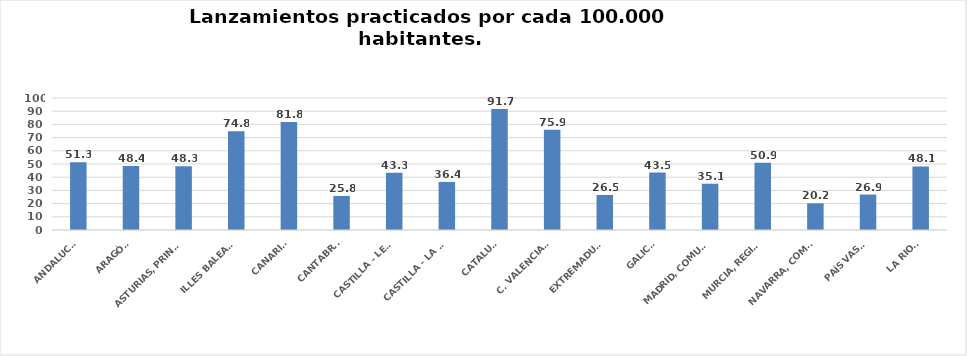
| Category | Series 0 |
|---|---|
| ANDALUCÍA | 51.324 |
| ARAGÓN | 48.405 |
| ASTURIAS, PRINCIPADO | 48.274 |
| ILLES BALEARS | 74.788 |
| CANARIAS | 81.829 |
| CANTABRIA | 25.794 |
| CASTILLA - LEÓN | 43.285 |
| CASTILLA - LA MANCHA | 36.429 |
| CATALUÑA | 91.728 |
| C. VALENCIANA | 75.893 |
| EXTREMADURA | 26.546 |
| GALICIA | 43.524 |
| MADRID, COMUNIDAD | 35.065 |
| MURCIA, REGIÓN | 50.853 |
| NAVARRA, COM. FORAL | 20.177 |
| PAÍS VASCO | 26.855 |
| LA RIOJA | 48.141 |